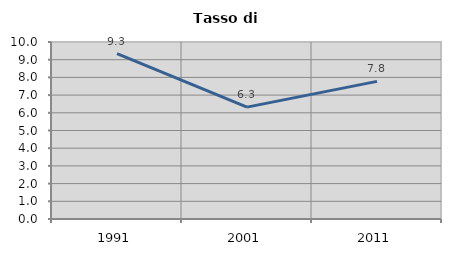
| Category | Tasso di disoccupazione   |
|---|---|
| 1991.0 | 9.342 |
| 2001.0 | 6.322 |
| 2011.0 | 7.775 |